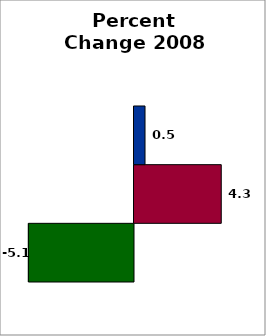
| Category | School | SREB states (average) | 50 states and D.C. (average) |
|---|---|---|---|
| 0 | -5.128 | 4.256 | 0.538 |